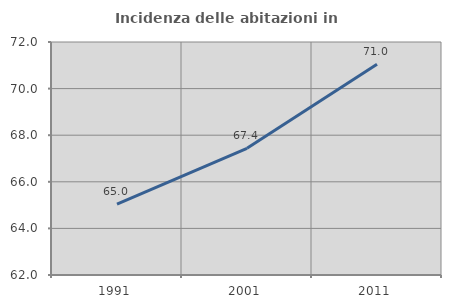
| Category | Incidenza delle abitazioni in proprietà  |
|---|---|
| 1991.0 | 65.041 |
| 2001.0 | 67.438 |
| 2011.0 | 71.047 |